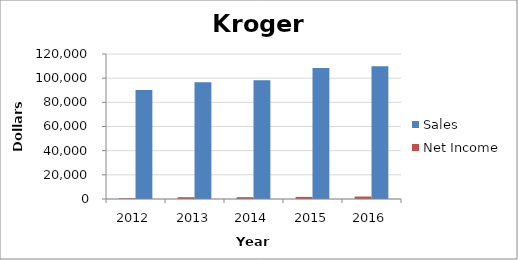
| Category | Sales | Net Income |
|---|---|---|
| 2016.0 | 109830 | 2039 |
| 2015.0 | 108465 | 1728 |
| 2014.0 | 98375 | 1519 |
| 2013.0 | 96619 | 1497 |
| 2012.0 | 90269 | 602 |